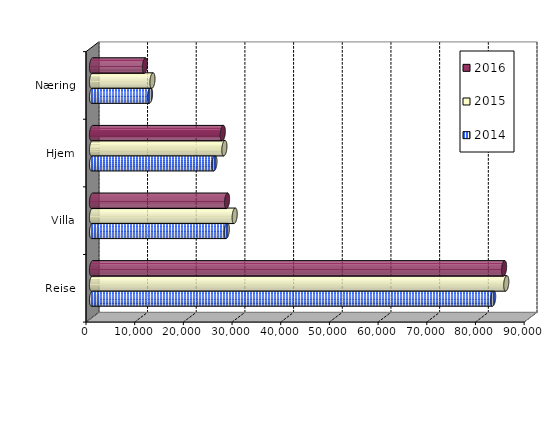
| Category | 2014 | 2015 | 2016 |
|---|---|---|---|
| Reise | 82399 | 85093 | 84640 |
| Villa | 27679 | 29310 | 27740.369 |
| Hjem | 25150 | 27189 | 26862 |
| Næring | 11918 | 12417 | 10872.839 |